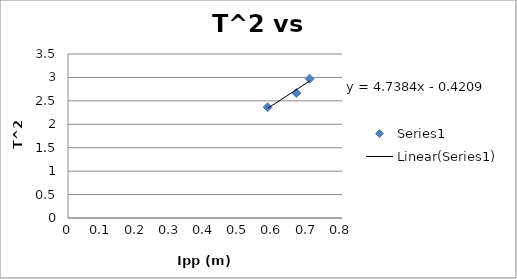
| Category | Series 0 |
|---|---|
| 0.583 | 2.364 |
| 0.7056 | 2.972 |
| 0.667 | 2.667 |